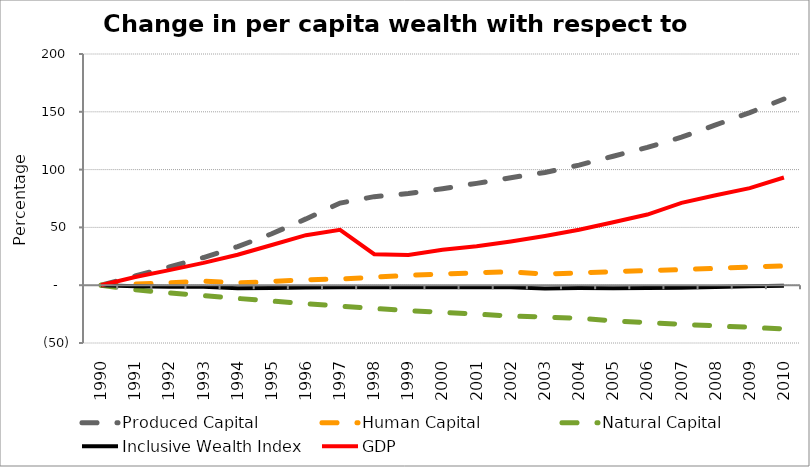
| Category | Produced Capital  | Human Capital | Natural Capital | Inclusive Wealth Index | GDP |
|---|---|---|---|---|---|
| 1990.0 | 0 | 0 | 0 | 0 | 0 |
| 1991.0 | 7.967 | 1.028 | -3.963 | -0.989 | 7.123 |
| 1992.0 | 15.801 | 1.993 | -6.647 | -1.37 | 13.013 |
| 1993.0 | 23.939 | 3.642 | -8.96 | -1.252 | 19.323 |
| 1994.0 | 33.434 | 1.928 | -11.425 | -2.539 | 26.385 |
| 1995.0 | 44.476 | 3.271 | -13.722 | -2.334 | 34.777 |
| 1996.0 | 57.342 | 4.735 | -16.029 | -1.952 | 43.261 |
| 1997.0 | 71.044 | 5.301 | -18.07 | -1.756 | 47.941 |
| 1998.0 | 76.592 | 6.957 | -20.159 | -1.708 | 26.805 |
| 1999.0 | 79.333 | 8.497 | -21.964 | -1.768 | 26.126 |
| 2000.0 | 83.477 | 9.736 | -23.487 | -1.713 | 30.605 |
| 2001.0 | 88.107 | 10.748 | -25.061 | -1.744 | 33.606 |
| 2002.0 | 92.988 | 11.64 | -26.613 | -1.798 | 37.818 |
| 2003.0 | 97.554 | 9.611 | -27.568 | -2.812 | 42.575 |
| 2004.0 | 103.891 | 10.661 | -28.53 | -2.396 | 47.903 |
| 2005.0 | 111.576 | 11.739 | -30.828 | -2.545 | 54.468 |
| 2006.0 | 119.224 | 12.593 | -32.32 | -2.385 | 61.111 |
| 2007.0 | 128.072 | 13.531 | -33.816 | -2.106 | 71.185 |
| 2008.0 | 138.681 | 14.499 | -35.212 | -1.637 | 77.747 |
| 2009.0 | 149.298 | 15.719 | -36.448 | -0.979 | 83.951 |
| 2010.0 | 161.081 | 16.745 | -37.848 | -0.403 | 93.182 |